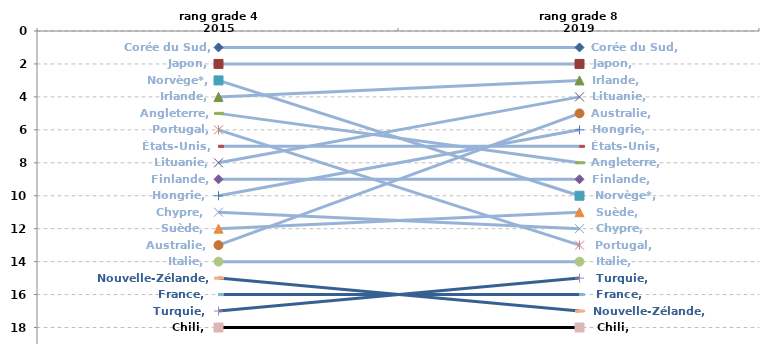
| Category | Corée du Sud | Japon | Irlande | Lituanie | Australie | Hongrie | États-Unis | Angleterre | Finlande | Norvège* | Suède | Chypre | Portugal | Italie | Turquie | France | Nouvelle-Zélande | Chili |
|---|---|---|---|---|---|---|---|---|---|---|---|---|---|---|---|---|---|---|
| rang grade 4 2015 | 1 | 2 | 4 | 8 | 13 | 10 | 7 | 5 | 9 | 3 | 12 | 11 | 6 | 14 | 17 | 16 | 15 | 18 |
| rang grade 8 2019 | 1 | 2 | 3 | 4 | 5 | 6 | 7 | 8 | 9 | 10 | 11 | 12 | 13 | 14 | 15 | 16 | 17 | 18 |